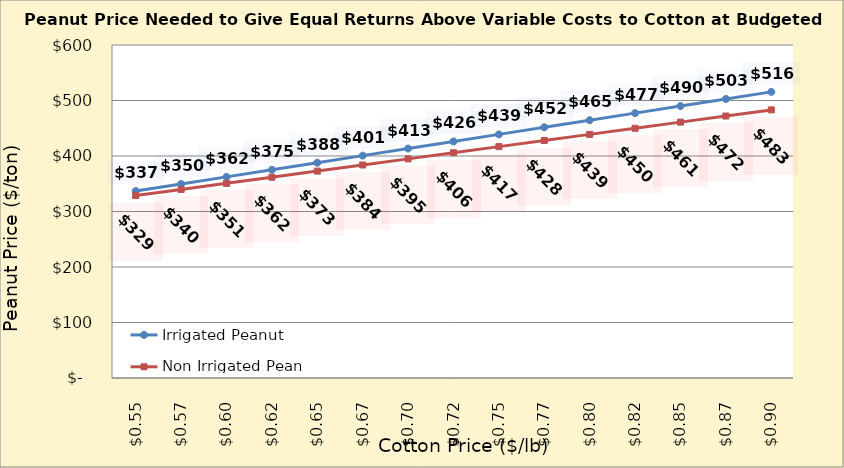
| Category | Irrigated Peanut | Non Irrigated Peanut |
|---|---|---|
| 0.5449999999999998 | 336.841 | 328.661 |
| 0.5699999999999998 | 349.607 | 339.691 |
| 0.5949999999999999 | 362.373 | 350.72 |
| 0.6199999999999999 | 375.139 | 361.75 |
| 0.6449999999999999 | 387.905 | 372.779 |
| 0.6699999999999999 | 400.671 | 383.808 |
| 0.695 | 413.437 | 394.838 |
| 0.72 | 426.203 | 405.867 |
| 0.745 | 438.969 | 416.897 |
| 0.77 | 451.735 | 427.926 |
| 0.795 | 464.501 | 438.956 |
| 0.8200000000000001 | 477.267 | 449.985 |
| 0.8450000000000001 | 490.033 | 461.014 |
| 0.8700000000000001 | 502.799 | 472.044 |
| 0.8950000000000001 | 515.564 | 483.073 |